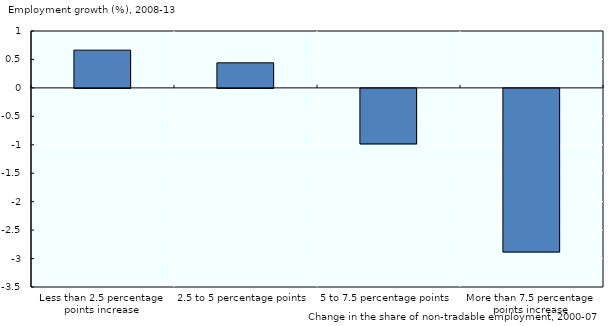
| Category | Series 0 |
|---|---|
| Less than 2.5 percentage points increase | 0.663 |
| 2.5 to 5 percentage points | 0.441 |
| 5 to 7.5 percentage points | -0.976 |
| More than 7.5 percentage points increase | -2.877 |